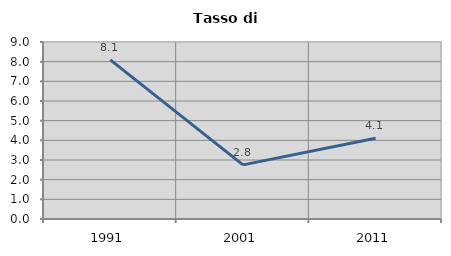
| Category | Tasso di disoccupazione   |
|---|---|
| 1991.0 | 8.088 |
| 2001.0 | 2.752 |
| 2011.0 | 4.11 |